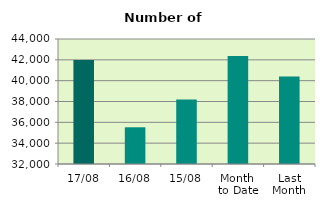
| Category | Series 0 |
|---|---|
| 17/08 | 41978 |
| 16/08 | 35524 |
| 15/08 | 38196 |
| Month 
to Date | 42375.692 |
| Last
Month | 40410.857 |